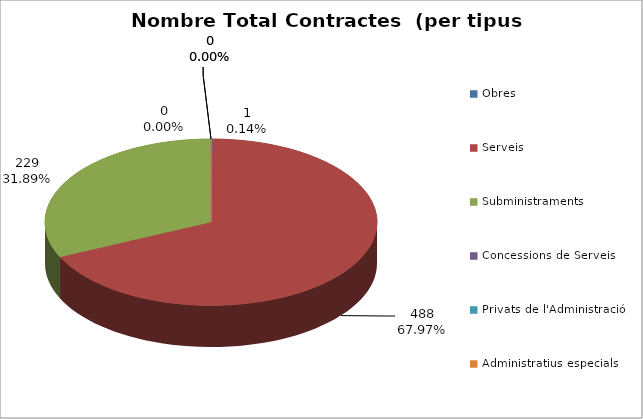
| Category | Nombre Total Contractes |
|---|---|
| Obres | 1 |
| Serveis | 488 |
| Subministraments | 229 |
| Concessions de Serveis | 0 |
| Privats de l'Administració | 0 |
| Administratius especials | 0 |